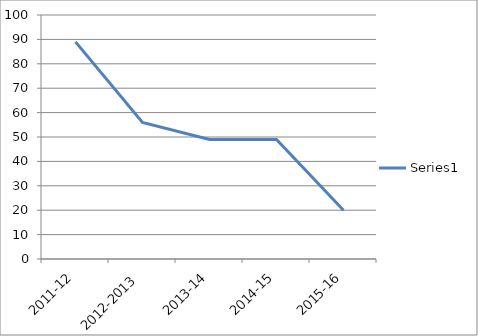
| Category | Series 0 |
|---|---|
| 2011-12 | 89 |
| 2012-2013 | 56 |
| 2013-14 | 49 |
| 2014-15 | 49 |
| 2015-16 | 20 |